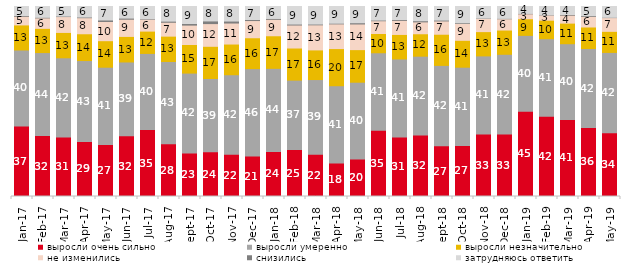
| Category | выросли очень сильно | выросли умеренно | выросли незначительно | не изменились | снизились | затрудняюсь ответить |
|---|---|---|---|---|---|---|
| 2017-01-01 | 37.15 | 39.95 | 13.2 | 4.55 | 0.4 | 4.75 |
| 2017-02-01 | 32.05 | 43.7 | 12.75 | 5.5 | 0.3 | 5.7 |
| 2017-03-01 | 31.3 | 41.7 | 13.35 | 8.35 | 0.25 | 5.05 |
| 2017-04-01 | 28.95 | 42.6 | 14.1 | 8.45 | 0.35 | 5.55 |
| 2017-05-01 | 27.4 | 40.65 | 13.95 | 10.1 | 0.8 | 7.1 |
| 2017-06-01 | 31.95 | 38.85 | 13.45 | 9.05 | 0.6 | 6.1 |
| 2017-07-01 | 35.25 | 40.05 | 11.75 | 6.25 | 0.25 | 6.45 |
| 2017-08-01 | 27.7 | 43.35 | 13.35 | 7.3 | 0.6 | 7.7 |
| 2017-09-01 | 22.95 | 42 | 15.05 | 10.2 | 0.85 | 8.95 |
| 2017-10-01 | 23.6 | 38.5 | 16.95 | 11.95 | 1.4 | 7.6 |
| 2017-11-01 | 22.25 | 41.8 | 16.15 | 11.05 | 1.05 | 7.65 |
| 2017-12-01 | 21.35 | 45.95 | 16.25 | 9.05 | 0.55 | 6.85 |
| 2018-01-01 | 23.75 | 43.7 | 17.15 | 8.65 | 0.45 | 6.3 |
| 2018-02-01 | 24.7 | 36.55 | 16.9 | 12.1 | 0.5 | 9.25 |
| 2018-03-01 | 22.25 | 39.3 | 15.6 | 13.2 | 0.4 | 9.25 |
| 2018-04-01 | 17.65 | 40.65 | 19.55 | 13 | 0.35 | 8.8 |
| 2018-05-01 | 19.75 | 40.4 | 17.15 | 13.5 | 0.65 | 8.55 |
| 2018-06-01 | 34.85 | 40.8 | 10.15 | 6.7 | 0.35 | 7.15 |
| 2018-07-01 | 31.3 | 41.05 | 12.9 | 7.4 | 0.45 | 6.85 |
| 2018-08-01 | 32.35 | 41.5 | 11.8 | 6.25 | 0.6 | 7.5 |
| 2018-09-01 | 26.7 | 42.3 | 16.4 | 7 | 0.45 | 7.15 |
| 2018-10-01 | 26.9 | 41.15 | 14.15 | 8.9 | 0.35 | 8.55 |
| 2018-11-01 | 32.934 | 41.068 | 12.774 | 7.036 | 0.1 | 6.088 |
| 2018-12-01 | 32.85 | 42 | 12.75 | 5.95 | 0.2 | 6.25 |
| 2019-01-01 | 44.85 | 39.95 | 8.75 | 2.6 | 0.2 | 3.65 |
| 2019-02-01 | 42.2 | 40.85 | 9.75 | 2.7 | 0.1 | 4.4 |
| 2019-03-01 | 40.527 | 39.881 | 10.84 | 4.177 | 0.348 | 4.227 |
| 2019-04-01 | 36.337 | 41.535 | 11.337 | 5.594 | 0.396 | 4.802 |
| 2019-05-01 | 33.531 | 42.298 | 11.095 | 7.231 | 0.149 | 5.696 |